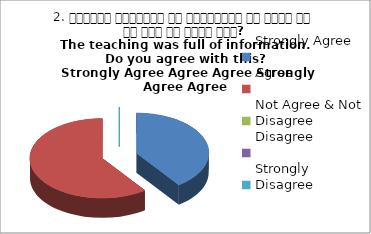
| Category | 2. शिक्षण जानकारी से परिपूर्ण था क्या आप इस बात से सहमत हैं?
The teaching was full of information. Do you agree with this?
 Strongly Agree Agree Agree Strongly Agree Agree |
|---|---|
| Strongly Agree | 2 |
| Agree | 3 |
| Not Agree & Not Disagree | 0 |
| Disagree | 0 |
| Strongly Disagree | 0 |